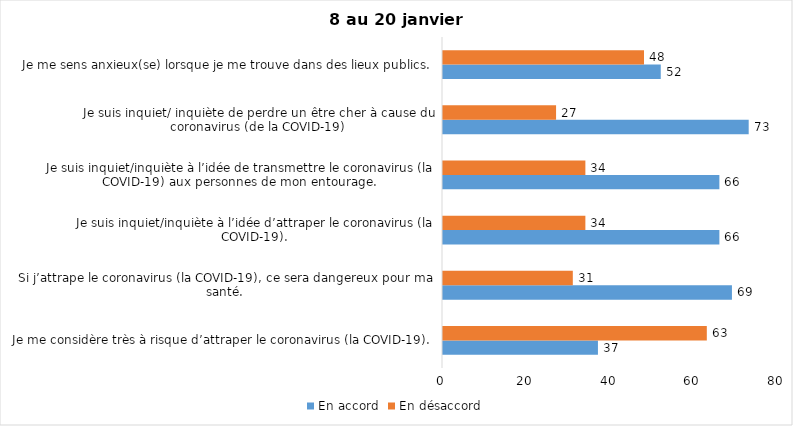
| Category | En accord | En désaccord |
|---|---|---|
| Je me considère très à risque d’attraper le coronavirus (la COVID-19). | 37 | 63 |
| Si j’attrape le coronavirus (la COVID-19), ce sera dangereux pour ma santé. | 69 | 31 |
| Je suis inquiet/inquiète à l’idée d’attraper le coronavirus (la COVID-19). | 66 | 34 |
| Je suis inquiet/inquiète à l’idée de transmettre le coronavirus (la COVID-19) aux personnes de mon entourage. | 66 | 34 |
| Je suis inquiet/ inquiète de perdre un être cher à cause du coronavirus (de la COVID-19) | 73 | 27 |
| Je me sens anxieux(se) lorsque je me trouve dans des lieux publics. | 52 | 48 |